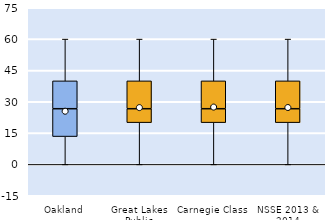
| Category | 25th | 50th | 75th |
|---|---|---|---|
| Oakland | 13.333 | 13.333 | 13.333 |
| Great Lakes Public | 20 | 6.667 | 13.333 |
| Carnegie Class | 20 | 6.667 | 13.333 |
| NSSE 2013 & 2014 | 20 | 6.667 | 13.333 |